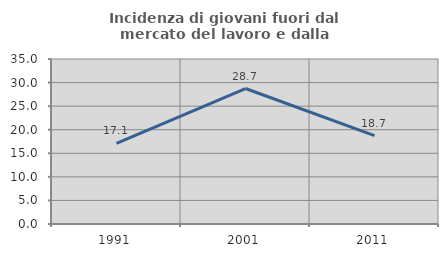
| Category | Incidenza di giovani fuori dal mercato del lavoro e dalla formazione  |
|---|---|
| 1991.0 | 17.123 |
| 2001.0 | 28.736 |
| 2011.0 | 18.738 |